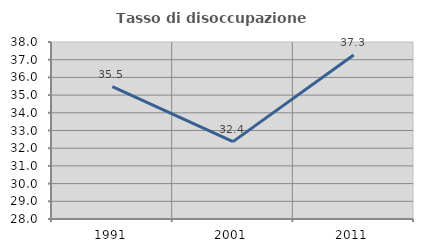
| Category | Tasso di disoccupazione giovanile  |
|---|---|
| 1991.0 | 35.474 |
| 2001.0 | 32.37 |
| 2011.0 | 37.269 |